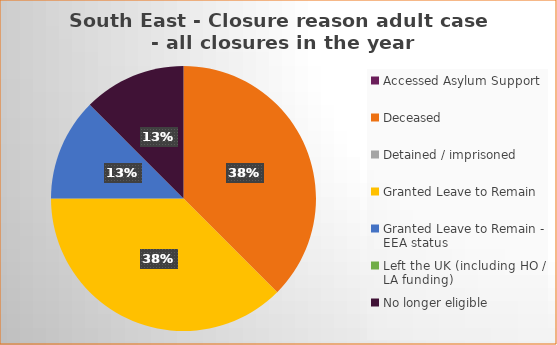
| Category | Total | Percentage |
|---|---|---|
| Accessed Asylum Support | 0 | 0 |
| Deceased | 3 | 0.37 |
| Detained / imprisoned | 0 | 0 |
| Granted Leave to Remain | 3 | 0.37 |
| Granted Leave to Remain - EEA status | 1 | 0.125 |
| Left the UK (including HO / LA funding)  | 0 | 0 |
| No longer eligible | 1 | 0.125 |